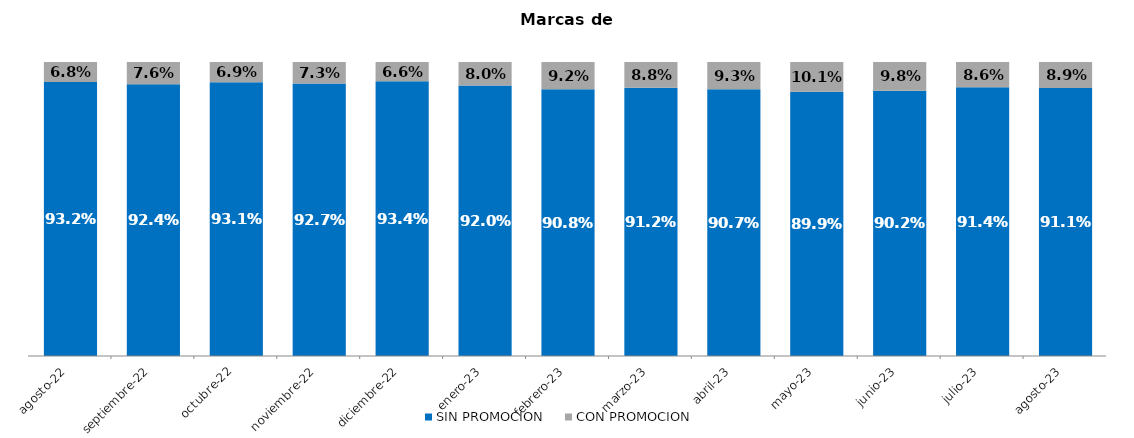
| Category | SIN PROMOCION   | CON PROMOCION   |
|---|---|---|
| 2022-08-01 | 0.932 | 0.068 |
| 2022-09-01 | 0.924 | 0.076 |
| 2022-10-01 | 0.931 | 0.069 |
| 2022-11-01 | 0.927 | 0.073 |
| 2022-12-01 | 0.934 | 0.066 |
| 2023-01-01 | 0.92 | 0.08 |
| 2023-02-01 | 0.908 | 0.092 |
| 2023-03-01 | 0.912 | 0.088 |
| 2023-04-01 | 0.907 | 0.093 |
| 2023-05-01 | 0.899 | 0.101 |
| 2023-06-01 | 0.902 | 0.098 |
| 2023-07-01 | 0.914 | 0.086 |
| 2023-08-01 | 0.911 | 0.089 |